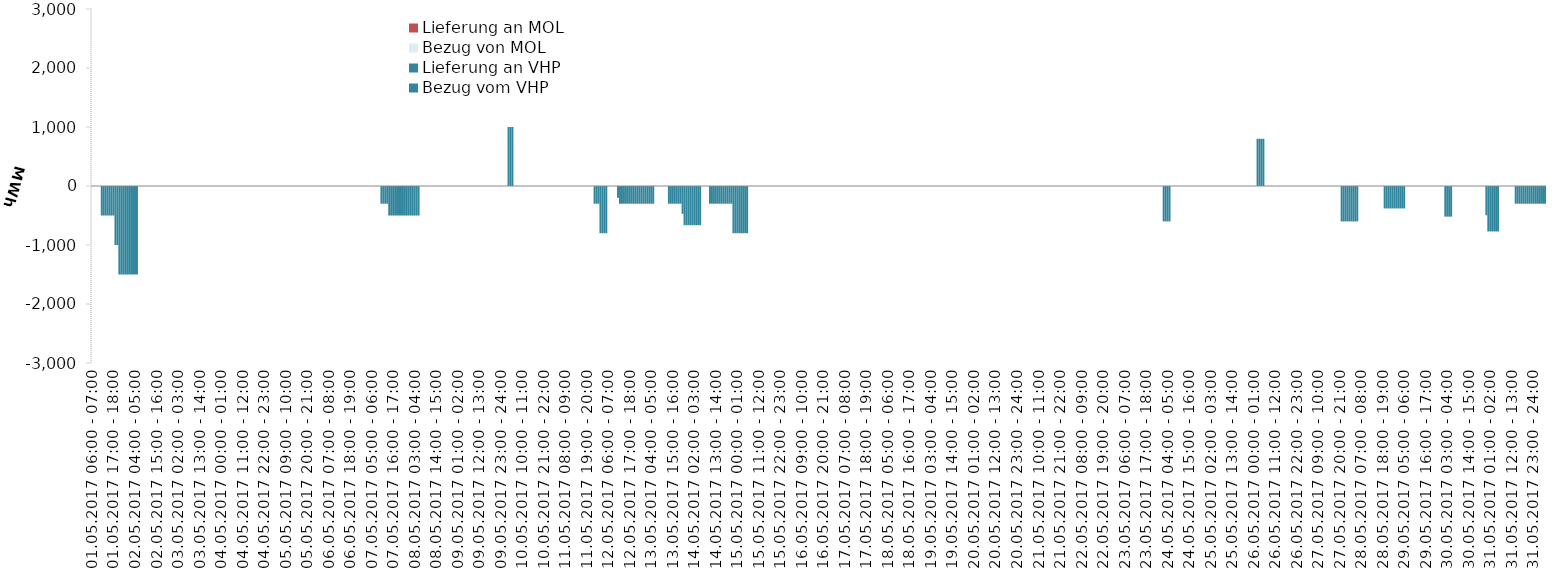
| Category | Bezug vom VHP | Lieferung an VHP | Bezug von MOL | Lieferung an MOL |
|---|---|---|---|---|
| 01.05.2017 06:00 - 07:00 | 0 | 0 | 0 | 0 |
| 01.05.2017 07:00 - 08:00 | 0 | 0 | 0 | 0 |
| 01.05.2017 08:00 - 09:00 | 0 | 0 | 0 | 0 |
| 01.05.2017 09:00 - 10:00 | 0 | 0 | 0 | 0 |
| 01.05.2017 10:00 - 11:00 | 0 | 0 | 0 | 0 |
| 01.05.2017 11:00 - 12:00 | 0 | -500 | 0 | 0 |
| 01.05.2017 12:00 - 13:00 | 0 | -500 | 0 | 0 |
| 01.05.2017 13:00 - 14:00 | 0 | -500 | 0 | 0 |
| 01.05.2017 14:00 - 15:00 | 0 | -500 | 0 | 0 |
| 01.05.2017 15:00 - 16:00 | 0 | -500 | 0 | 0 |
| 01.05.2017 16:00 - 17:00 | 0 | -500 | 0 | 0 |
| 01.05.2017 17:00 - 18:00 | 0 | -500 | 0 | 0 |
| 01.05.2017 18:00 - 19:00 | 0 | -1000 | 0 | 0 |
| 01.05.2017 19:00 - 20:00 | 0 | -1000 | 0 | 0 |
| 01.05.2017 20:00 - 21:00 | 0 | -1500 | 0 | 0 |
| 01.05.2017 21:00 - 22:00 | 0 | -1500 | 0 | 0 |
| 01.05.2017 22:00 - 23:00 | 0 | -1500 | 0 | 0 |
| 01.05.2017 23:00 - 24:00 | 0 | -1500 | 0 | 0 |
| 02.05.2017 00:00 - 01:00 | 0 | -1500 | 0 | 0 |
| 02.05.2017 01:00 - 02:00 | 0 | -1500 | 0 | 0 |
| 02.05.2017 02:00 - 03:00 | 0 | -1500 | 0 | 0 |
| 02.05.2017 03:00 - 04:00 | 0 | -1500 | 0 | 0 |
| 02.05.2017 04:00 - 05:00 | 0 | -1500 | 0 | 0 |
| 02.05.2017 05:00 - 06:00 | 0 | -1500 | 0 | 0 |
| 02.05.2017 06:00 - 07:00 | 0 | 0 | 0 | 0 |
| 02.05.2017 07:00 - 08:00 | 0 | 0 | 0 | 0 |
| 02.05.2017 08:00 - 09:00 | 0 | 0 | 0 | 0 |
| 02.05.2017 09:00 - 10:00 | 0 | 0 | 0 | 0 |
| 02.05.2017 10:00 - 11:00 | 0 | 0 | 0 | 0 |
| 02.05.2017 11:00 - 12:00 | 0 | 0 | 0 | 0 |
| 02.05.2017 12:00 - 13:00 | 0 | 0 | 0 | 0 |
| 02.05.2017 13:00 - 14:00 | 0 | 0 | 0 | 0 |
| 02.05.2017 14:00 - 15:00 | 0 | 0 | 0 | 0 |
| 02.05.2017 15:00 - 16:00 | 0 | 0 | 0 | 0 |
| 02.05.2017 16:00 - 17:00 | 0 | 0 | 0 | 0 |
| 02.05.2017 17:00 - 18:00 | 0 | 0 | 0 | 0 |
| 02.05.2017 18:00 - 19:00 | 0 | 0 | 0 | 0 |
| 02.05.2017 19:00 - 20:00 | 0 | 0 | 0 | 0 |
| 02.05.2017 20:00 - 21:00 | 0 | 0 | 0 | 0 |
| 02.05.2017 21:00 - 22:00 | 0 | 0 | 0 | 0 |
| 02.05.2017 22:00 - 23:00 | 0 | 0 | 0 | 0 |
| 02.05.2017 23:00 - 24:00 | 0 | 0 | 0 | 0 |
| 03.05.2017 00:00 - 01:00 | 0 | 0 | 0 | 0 |
| 03.05.2017 01:00 - 02:00 | 0 | 0 | 0 | 0 |
| 03.05.2017 02:00 - 03:00 | 0 | 0 | 0 | 0 |
| 03.05.2017 03:00 - 04:00 | 0 | 0 | 0 | 0 |
| 03.05.2017 04:00 - 05:00 | 0 | 0 | 0 | 0 |
| 03.05.2017 05:00 - 06:00 | 0 | 0 | 0 | 0 |
| 03.05.2017 06:00 - 07:00 | 0 | 0 | 0 | 0 |
| 03.05.2017 07:00 - 08:00 | 0 | 0 | 0 | 0 |
| 03.05.2017 08:00 - 09:00 | 0 | 0 | 0 | 0 |
| 03.05.2017 09:00 - 10:00 | 0 | 0 | 0 | 0 |
| 03.05.2017 10:00 - 11:00 | 0 | 0 | 0 | 0 |
| 03.05.2017 11:00 - 12:00 | 0 | 0 | 0 | 0 |
| 03.05.2017 12:00 - 13:00 | 0 | 0 | 0 | 0 |
| 03.05.2017 13:00 - 14:00 | 0 | 0 | 0 | 0 |
| 03.05.2017 14:00 - 15:00 | 0 | 0 | 0 | 0 |
| 03.05.2017 15:00 - 16:00 | 0 | 0 | 0 | 0 |
| 03.05.2017 16:00 - 17:00 | 0 | 0 | 0 | 0 |
| 03.05.2017 17:00 - 18:00 | 0 | 0 | 0 | 0 |
| 03.05.2017 18:00 - 19:00 | 0 | 0 | 0 | 0 |
| 03.05.2017 19:00 - 20:00 | 0 | 0 | 0 | 0 |
| 03.05.2017 20:00 - 21:00 | 0 | 0 | 0 | 0 |
| 03.05.2017 21:00 - 22:00 | 0 | 0 | 0 | 0 |
| 03.05.2017 22:00 - 23:00 | 0 | 0 | 0 | 0 |
| 03.05.2017 23:00 - 24:00 | 0 | 0 | 0 | 0 |
| 04.05.2017 00:00 - 01:00 | 0 | 0 | 0 | 0 |
| 04.05.2017 01:00 - 02:00 | 0 | 0 | 0 | 0 |
| 04.05.2017 02:00 - 03:00 | 0 | 0 | 0 | 0 |
| 04.05.2017 03:00 - 04:00 | 0 | 0 | 0 | 0 |
| 04.05.2017 04:00 - 05:00 | 0 | 0 | 0 | 0 |
| 04.05.2017 05:00 - 06:00 | 0 | 0 | 0 | 0 |
| 04.05.2017 06:00 - 07:00 | 0 | 0 | 0 | 0 |
| 04.05.2017 07:00 - 08:00 | 0 | 0 | 0 | 0 |
| 04.05.2017 08:00 - 09:00 | 0 | 0 | 0 | 0 |
| 04.05.2017 09:00 - 10:00 | 0 | 0 | 0 | 0 |
| 04.05.2017 10:00 - 11:00 | 0 | 0 | 0 | 0 |
| 04.05.2017 11:00 - 12:00 | 0 | 0 | 0 | 0 |
| 04.05.2017 12:00 - 13:00 | 0 | 0 | 0 | 0 |
| 04.05.2017 13:00 - 14:00 | 0 | 0 | 0 | 0 |
| 04.05.2017 14:00 - 15:00 | 0 | 0 | 0 | 0 |
| 04.05.2017 15:00 - 16:00 | 0 | 0 | 0 | 0 |
| 04.05.2017 16:00 - 17:00 | 0 | 0 | 0 | 0 |
| 04.05.2017 17:00 - 18:00 | 0 | 0 | 0 | 0 |
| 04.05.2017 18:00 - 19:00 | 0 | 0 | 0 | 0 |
| 04.05.2017 19:00 - 20:00 | 0 | 0 | 0 | 0 |
| 04.05.2017 20:00 - 21:00 | 0 | 0 | 0 | 0 |
| 04.05.2017 21:00 - 22:00 | 0 | 0 | 0 | 0 |
| 04.05.2017 22:00 - 23:00 | 0 | 0 | 0 | 0 |
| 04.05.2017 23:00 - 24:00 | 0 | 0 | 0 | 0 |
| 05.05.2017 00:00 - 01:00 | 0 | 0 | 0 | 0 |
| 05.05.2017 01:00 - 02:00 | 0 | 0 | 0 | 0 |
| 05.05.2017 02:00 - 03:00 | 0 | 0 | 0 | 0 |
| 05.05.2017 03:00 - 04:00 | 0 | 0 | 0 | 0 |
| 05.05.2017 04:00 - 05:00 | 0 | 0 | 0 | 0 |
| 05.05.2017 05:00 - 06:00 | 0 | 0 | 0 | 0 |
| 05.05.2017 06:00 - 07:00 | 0 | 0 | 0 | 0 |
| 05.05.2017 07:00 - 08:00 | 0 | 0 | 0 | 0 |
| 05.05.2017 08:00 - 09:00 | 0 | 0 | 0 | 0 |
| 05.05.2017 09:00 - 10:00 | 0 | 0 | 0 | 0 |
| 05.05.2017 10:00 - 11:00 | 0 | 0 | 0 | 0 |
| 05.05.2017 11:00 - 12:00 | 0 | 0 | 0 | 0 |
| 05.05.2017 12:00 - 13:00 | 0 | 0 | 0 | 0 |
| 05.05.2017 13:00 - 14:00 | 0 | 0 | 0 | 0 |
| 05.05.2017 14:00 - 15:00 | 0 | 0 | 0 | 0 |
| 05.05.2017 15:00 - 16:00 | 0 | 0 | 0 | 0 |
| 05.05.2017 16:00 - 17:00 | 0 | 0 | 0 | 0 |
| 05.05.2017 17:00 - 18:00 | 0 | 0 | 0 | 0 |
| 05.05.2017 18:00 - 19:00 | 0 | 0 | 0 | 0 |
| 05.05.2017 19:00 - 20:00 | 0 | 0 | 0 | 0 |
| 05.05.2017 20:00 - 21:00 | 0 | 0 | 0 | 0 |
| 05.05.2017 21:00 - 22:00 | 0 | 0 | 0 | 0 |
| 05.05.2017 22:00 - 23:00 | 0 | 0 | 0 | 0 |
| 05.05.2017 23:00 - 24:00 | 0 | 0 | 0 | 0 |
| 06.05.2017 00:00 - 01:00 | 0 | 0 | 0 | 0 |
| 06.05.2017 01:00 - 02:00 | 0 | 0 | 0 | 0 |
| 06.05.2017 02:00 - 03:00 | 0 | 0 | 0 | 0 |
| 06.05.2017 03:00 - 04:00 | 0 | 0 | 0 | 0 |
| 06.05.2017 04:00 - 05:00 | 0 | 0 | 0 | 0 |
| 06.05.2017 05:00 - 06:00 | 0 | 0 | 0 | 0 |
| 06.05.2017 06:00 - 07:00 | 0 | 0 | 0 | 0 |
| 06.05.2017 07:00 - 08:00 | 0 | 0 | 0 | 0 |
| 06.05.2017 08:00 - 09:00 | 0 | 0 | 0 | 0 |
| 06.05.2017 09:00 - 10:00 | 0 | 0 | 0 | 0 |
| 06.05.2017 10:00 - 11:00 | 0 | 0 | 0 | 0 |
| 06.05.2017 11:00 - 12:00 | 0 | 0 | 0 | 0 |
| 06.05.2017 12:00 - 13:00 | 0 | 0 | 0 | 0 |
| 06.05.2017 13:00 - 14:00 | 0 | 0 | 0 | 0 |
| 06.05.2017 14:00 - 15:00 | 0 | 0 | 0 | 0 |
| 06.05.2017 15:00 - 16:00 | 0 | 0 | 0 | 0 |
| 06.05.2017 16:00 - 17:00 | 0 | 0 | 0 | 0 |
| 06.05.2017 17:00 - 18:00 | 0 | 0 | 0 | 0 |
| 06.05.2017 18:00 - 19:00 | 0 | 0 | 0 | 0 |
| 06.05.2017 19:00 - 20:00 | 0 | 0 | 0 | 0 |
| 06.05.2017 20:00 - 21:00 | 0 | 0 | 0 | 0 |
| 06.05.2017 21:00 - 22:00 | 0 | 0 | 0 | 0 |
| 06.05.2017 22:00 - 23:00 | 0 | 0 | 0 | 0 |
| 06.05.2017 23:00 - 24:00 | 0 | 0 | 0 | 0 |
| 07.05.2017 00:00 - 01:00 | 0 | 0 | 0 | 0 |
| 07.05.2017 01:00 - 02:00 | 0 | 0 | 0 | 0 |
| 07.05.2017 02:00 - 03:00 | 0 | 0 | 0 | 0 |
| 07.05.2017 03:00 - 04:00 | 0 | 0 | 0 | 0 |
| 07.05.2017 04:00 - 05:00 | 0 | 0 | 0 | 0 |
| 07.05.2017 05:00 - 06:00 | 0 | 0 | 0 | 0 |
| 07.05.2017 06:00 - 07:00 | 0 | 0 | 0 | 0 |
| 07.05.2017 07:00 - 08:00 | 0 | 0 | 0 | 0 |
| 07.05.2017 08:00 - 09:00 | 0 | 0 | 0 | 0 |
| 07.05.2017 09:00 - 10:00 | 0 | 0 | 0 | 0 |
| 07.05.2017 10:00 - 11:00 | 0 | -300 | 0 | 0 |
| 07.05.2017 11:00 - 12:00 | 0 | -300 | 0 | 0 |
| 07.05.2017 12:00 - 13:00 | 0 | -300 | 0 | 0 |
| 07.05.2017 13:00 - 14:00 | 0 | -300 | 0 | 0 |
| 07.05.2017 14:00 - 15:00 | 0 | -500 | 0 | 0 |
| 07.05.2017 15:00 - 16:00 | 0 | -500 | 0 | 0 |
| 07.05.2017 16:00 - 17:00 | 0 | -500 | 0 | 0 |
| 07.05.2017 17:00 - 18:00 | 0 | -500 | 0 | 0 |
| 07.05.2017 18:00 - 19:00 | 0 | -500 | 0 | 0 |
| 07.05.2017 19:00 - 20:00 | 0 | -500 | 0 | 0 |
| 07.05.2017 20:00 - 21:00 | 0 | -500 | 0 | 0 |
| 07.05.2017 21:00 - 22:00 | 0 | -500 | 0 | 0 |
| 07.05.2017 22:00 - 23:00 | 0 | -500 | 0 | 0 |
| 07.05.2017 23:00 - 24:00 | 0 | -500 | 0 | 0 |
| 08.05.2017 00:00 - 01:00 | 0 | -500 | 0 | 0 |
| 08.05.2017 01:00 - 02:00 | 0 | -500 | 0 | 0 |
| 08.05.2017 02:00 - 03:00 | 0 | -500 | 0 | 0 |
| 08.05.2017 03:00 - 04:00 | 0 | -500 | 0 | 0 |
| 08.05.2017 04:00 - 05:00 | 0 | -500 | 0 | 0 |
| 08.05.2017 05:00 - 06:00 | 0 | -500 | 0 | 0 |
| 08.05.2017 06:00 - 07:00 | 0 | 0 | 0 | 0 |
| 08.05.2017 07:00 - 08:00 | 0 | 0 | 0 | 0 |
| 08.05.2017 08:00 - 09:00 | 0 | 0 | 0 | 0 |
| 08.05.2017 09:00 - 10:00 | 0 | 0 | 0 | 0 |
| 08.05.2017 10:00 - 11:00 | 0 | 0 | 0 | 0 |
| 08.05.2017 11:00 - 12:00 | 0 | 0 | 0 | 0 |
| 08.05.2017 12:00 - 13:00 | 0 | 0 | 0 | 0 |
| 08.05.2017 13:00 - 14:00 | 0 | 0 | 0 | 0 |
| 08.05.2017 14:00 - 15:00 | 0 | 0 | 0 | 0 |
| 08.05.2017 15:00 - 16:00 | 0 | 0 | 0 | 0 |
| 08.05.2017 16:00 - 17:00 | 0 | 0 | 0 | 0 |
| 08.05.2017 17:00 - 18:00 | 0 | 0 | 0 | 0 |
| 08.05.2017 18:00 - 19:00 | 0 | 0 | 0 | 0 |
| 08.05.2017 19:00 - 20:00 | 0 | 0 | 0 | 0 |
| 08.05.2017 20:00 - 21:00 | 0 | 0 | 0 | 0 |
| 08.05.2017 21:00 - 22:00 | 0 | 0 | 0 | 0 |
| 08.05.2017 22:00 - 23:00 | 0 | 0 | 0 | 0 |
| 08.05.2017 23:00 - 24:00 | 0 | 0 | 0 | 0 |
| 09.05.2017 00:00 - 01:00 | 0 | 0 | 0 | 0 |
| 09.05.2017 01:00 - 02:00 | 0 | 0 | 0 | 0 |
| 09.05.2017 02:00 - 03:00 | 0 | 0 | 0 | 0 |
| 09.05.2017 03:00 - 04:00 | 0 | 0 | 0 | 0 |
| 09.05.2017 04:00 - 05:00 | 0 | 0 | 0 | 0 |
| 09.05.2017 05:00 - 06:00 | 0 | 0 | 0 | 0 |
| 09.05.2017 06:00 - 07:00 | 0 | 0 | 0 | 0 |
| 09.05.2017 07:00 - 08:00 | 0 | 0 | 0 | 0 |
| 09.05.2017 08:00 - 09:00 | 0 | 0 | 0 | 0 |
| 09.05.2017 09:00 - 10:00 | 0 | 0 | 0 | 0 |
| 09.05.2017 10:00 - 11:00 | 0 | 0 | 0 | 0 |
| 09.05.2017 11:00 - 12:00 | 0 | 0 | 0 | 0 |
| 09.05.2017 12:00 - 13:00 | 0 | 0 | 0 | 0 |
| 09.05.2017 13:00 - 14:00 | 0 | 0 | 0 | 0 |
| 09.05.2017 14:00 - 15:00 | 0 | 0 | 0 | 0 |
| 09.05.2017 15:00 - 16:00 | 0 | 0 | 0 | 0 |
| 09.05.2017 16:00 - 17:00 | 0 | 0 | 0 | 0 |
| 09.05.2017 17:00 - 18:00 | 0 | 0 | 0 | 0 |
| 09.05.2017 18:00 - 19:00 | 0 | 0 | 0 | 0 |
| 09.05.2017 19:00 - 20:00 | 0 | 0 | 0 | 0 |
| 09.05.2017 20:00 - 21:00 | 0 | 0 | 0 | 0 |
| 09.05.2017 21:00 - 22:00 | 0 | 0 | 0 | 0 |
| 09.05.2017 22:00 - 23:00 | 0 | 0 | 0 | 0 |
| 09.05.2017 23:00 - 24:00 | 0 | 0 | 0 | 0 |
| 10.05.2017 00:00 - 01:00 | 0 | 0 | 0 | 0 |
| 10.05.2017 01:00 - 02:00 | 0 | 0 | 0 | 0 |
| 10.05.2017 02:00 - 03:00 | 0 | 0 | 0 | 0 |
| 10.05.2017 03:00 - 04:00 | 1000 | 0 | 0 | 0 |
| 10.05.2017 04:00 - 05:00 | 1000 | 0 | 0 | 0 |
| 10.05.2017 05:00 - 06:00 | 1000 | 0 | 0 | 0 |
| 10.05.2017 06:00 - 07:00 | 0 | 0 | 0 | 0 |
| 10.05.2017 07:00 - 08:00 | 0 | 0 | 0 | 0 |
| 10.05.2017 08:00 - 09:00 | 0 | 0 | 0 | 0 |
| 10.05.2017 09:00 - 10:00 | 0 | 0 | 0 | 0 |
| 10.05.2017 10:00 - 11:00 | 0 | 0 | 0 | 0 |
| 10.05.2017 11:00 - 12:00 | 0 | 0 | 0 | 0 |
| 10.05.2017 12:00 - 13:00 | 0 | 0 | 0 | 0 |
| 10.05.2017 13:00 - 14:00 | 0 | 0 | 0 | 0 |
| 10.05.2017 14:00 - 15:00 | 0 | 0 | 0 | 0 |
| 10.05.2017 15:00 - 16:00 | 0 | 0 | 0 | 0 |
| 10.05.2017 16:00 - 17:00 | 0 | 0 | 0 | 0 |
| 10.05.2017 17:00 - 18:00 | 0 | 0 | 0 | 0 |
| 10.05.2017 18:00 - 19:00 | 0 | 0 | 0 | 0 |
| 10.05.2017 19:00 - 20:00 | 0 | 0 | 0 | 0 |
| 10.05.2017 20:00 - 21:00 | 0 | 0 | 0 | 0 |
| 10.05.2017 21:00 - 22:00 | 0 | 0 | 0 | 0 |
| 10.05.2017 22:00 - 23:00 | 0 | 0 | 0 | 0 |
| 10.05.2017 23:00 - 24:00 | 0 | 0 | 0 | 0 |
| 11.05.2017 00:00 - 01:00 | 0 | 0 | 0 | 0 |
| 11.05.2017 01:00 - 02:00 | 0 | 0 | 0 | 0 |
| 11.05.2017 02:00 - 03:00 | 0 | 0 | 0 | 0 |
| 11.05.2017 03:00 - 04:00 | 0 | 0 | 0 | 0 |
| 11.05.2017 04:00 - 05:00 | 0 | 0 | 0 | 0 |
| 11.05.2017 05:00 - 06:00 | 0 | 0 | 0 | 0 |
| 11.05.2017 06:00 - 07:00 | 0 | 0 | 0 | 0 |
| 11.05.2017 07:00 - 08:00 | 0 | 0 | 0 | 0 |
| 11.05.2017 08:00 - 09:00 | 0 | 0 | 0 | 0 |
| 11.05.2017 09:00 - 10:00 | 0 | 0 | 0 | 0 |
| 11.05.2017 10:00 - 11:00 | 0 | 0 | 0 | 0 |
| 11.05.2017 11:00 - 12:00 | 0 | 0 | 0 | 0 |
| 11.05.2017 12:00 - 13:00 | 0 | 0 | 0 | 0 |
| 11.05.2017 13:00 - 14:00 | 0 | 0 | 0 | 0 |
| 11.05.2017 14:00 - 15:00 | 0 | 0 | 0 | 0 |
| 11.05.2017 15:00 - 16:00 | 0 | 0 | 0 | 0 |
| 11.05.2017 16:00 - 17:00 | 0 | 0 | 0 | 0 |
| 11.05.2017 17:00 - 18:00 | 0 | 0 | 0 | 0 |
| 11.05.2017 18:00 - 19:00 | 0 | 0 | 0 | 0 |
| 11.05.2017 19:00 - 20:00 | 0 | 0 | 0 | 0 |
| 11.05.2017 20:00 - 21:00 | 0 | 0 | 0 | 0 |
| 11.05.2017 21:00 - 22:00 | 0 | 0 | 0 | 0 |
| 11.05.2017 22:00 - 23:00 | 0 | 0 | 0 | 0 |
| 11.05.2017 23:00 - 24:00 | 0 | -300 | 0 | 0 |
| 12.05.2017 00:00 - 01:00 | 0 | -300 | 0 | 0 |
| 12.05.2017 01:00 - 02:00 | 0 | -300 | 0 | 0 |
| 12.05.2017 02:00 - 03:00 | 0 | -800 | 0 | 0 |
| 12.05.2017 03:00 - 04:00 | 0 | -800 | 0 | 0 |
| 12.05.2017 04:00 - 05:00 | 0 | -800 | 0 | 0 |
| 12.05.2017 05:00 - 06:00 | 0 | -800 | 0 | 0 |
| 12.05.2017 06:00 - 07:00 | 0 | 0 | 0 | 0 |
| 12.05.2017 07:00 - 08:00 | 0 | 0 | 0 | 0 |
| 12.05.2017 08:00 - 09:00 | 0 | 0 | 0 | 0 |
| 12.05.2017 09:00 - 10:00 | 0 | 0 | 0 | 0 |
| 12.05.2017 10:00 - 11:00 | 0 | 0 | 0 | 0 |
| 12.05.2017 11:00 - 12:00 | 0 | -200 | 0 | 0 |
| 12.05.2017 12:00 - 13:00 | 0 | -300 | 0 | 0 |
| 12.05.2017 13:00 - 14:00 | 0 | -300 | 0 | 0 |
| 12.05.2017 14:00 - 15:00 | 0 | -300 | 0 | 0 |
| 12.05.2017 15:00 - 16:00 | 0 | -300 | 0 | 0 |
| 12.05.2017 16:00 - 17:00 | 0 | -300 | 0 | 0 |
| 12.05.2017 17:00 - 18:00 | 0 | -300 | 0 | 0 |
| 12.05.2017 18:00 - 19:00 | 0 | -300 | 0 | 0 |
| 12.05.2017 19:00 - 20:00 | 0 | -300 | 0 | 0 |
| 12.05.2017 20:00 - 21:00 | 0 | -300 | 0 | 0 |
| 12.05.2017 21:00 - 22:00 | 0 | -300 | 0 | 0 |
| 12.05.2017 22:00 - 23:00 | 0 | -300 | 0 | 0 |
| 12.05.2017 23:00 - 24:00 | 0 | -300 | 0 | 0 |
| 13.05.2017 00:00 - 01:00 | 0 | -300 | 0 | 0 |
| 13.05.2017 01:00 - 02:00 | 0 | -300 | 0 | 0 |
| 13.05.2017 02:00 - 03:00 | 0 | -300 | 0 | 0 |
| 13.05.2017 03:00 - 04:00 | 0 | -300 | 0 | 0 |
| 13.05.2017 04:00 - 05:00 | 0 | -300 | 0 | 0 |
| 13.05.2017 05:00 - 06:00 | 0 | -300 | 0 | 0 |
| 13.05.2017 06:00 - 07:00 | 0 | 0 | 0 | 0 |
| 13.05.2017 07:00 - 08:00 | 0 | 0 | 0 | 0 |
| 13.05.2017 08:00 - 09:00 | 0 | 0 | 0 | 0 |
| 13.05.2017 09:00 - 10:00 | 0 | 0 | 0 | 0 |
| 13.05.2017 10:00 - 11:00 | 0 | 0 | 0 | 0 |
| 13.05.2017 11:00 - 12:00 | 0 | 0 | 0 | 0 |
| 13.05.2017 12:00 - 13:00 | 0 | 0 | 0 | 0 |
| 13.05.2017 13:00 - 14:00 | 0 | -300 | 0 | 0 |
| 13.05.2017 14:00 - 15:00 | 0 | -300 | 0 | 0 |
| 13.05.2017 15:00 - 16:00 | 0 | -300 | 0 | 0 |
| 13.05.2017 16:00 - 17:00 | 0 | -300 | 0 | 0 |
| 13.05.2017 17:00 - 18:00 | 0 | -300 | 0 | 0 |
| 13.05.2017 18:00 - 19:00 | 0 | -300 | 0 | 0 |
| 13.05.2017 19:00 - 20:00 | 0 | -300 | 0 | 0 |
| 13.05.2017 20:00 - 21:00 | 0 | -472 | 0 | 0 |
| 13.05.2017 21:00 - 22:00 | 0 | -664 | 0 | 0 |
| 13.05.2017 22:00 - 23:00 | 0 | -664 | 0 | 0 |
| 13.05.2017 23:00 - 24:00 | 0 | -664 | 0 | 0 |
| 14.05.2017 00:00 - 01:00 | 0 | -664 | 0 | 0 |
| 14.05.2017 01:00 - 02:00 | 0 | -664 | 0 | 0 |
| 14.05.2017 02:00 - 03:00 | 0 | -664 | 0 | 0 |
| 14.05.2017 03:00 - 04:00 | 0 | -664 | 0 | 0 |
| 14.05.2017 04:00 - 05:00 | 0 | -664 | 0 | 0 |
| 14.05.2017 05:00 - 06:00 | 0 | -664 | 0 | 0 |
| 14.05.2017 06:00 - 07:00 | 0 | 0 | 0 | 0 |
| 14.05.2017 07:00 - 08:00 | 0 | 0 | 0 | 0 |
| 14.05.2017 08:00 - 09:00 | 0 | 0 | 0 | 0 |
| 14.05.2017 09:00 - 10:00 | 0 | 0 | 0 | 0 |
| 14.05.2017 10:00 - 11:00 | 0 | -300 | 0 | 0 |
| 14.05.2017 11:00 - 12:00 | 0 | -300 | 0 | 0 |
| 14.05.2017 12:00 - 13:00 | 0 | -300 | 0 | 0 |
| 14.05.2017 13:00 - 14:00 | 0 | -300 | 0 | 0 |
| 14.05.2017 14:00 - 15:00 | 0 | -300 | 0 | 0 |
| 14.05.2017 15:00 - 16:00 | 0 | -300 | 0 | 0 |
| 14.05.2017 16:00 - 17:00 | 0 | -300 | 0 | 0 |
| 14.05.2017 17:00 - 18:00 | 0 | -300 | 0 | 0 |
| 14.05.2017 18:00 - 19:00 | 0 | -300 | 0 | 0 |
| 14.05.2017 19:00 - 20:00 | 0 | -300 | 0 | 0 |
| 14.05.2017 20:00 - 21:00 | 0 | -300 | 0 | 0 |
| 14.05.2017 21:00 - 22:00 | 0 | -300 | 0 | 0 |
| 14.05.2017 22:00 - 23:00 | 0 | -800 | 0 | 0 |
| 14.05.2017 23:00 - 24:00 | 0 | -800 | 0 | 0 |
| 15.05.2017 00:00 - 01:00 | 0 | -800 | 0 | 0 |
| 15.05.2017 01:00 - 02:00 | 0 | -800 | 0 | 0 |
| 15.05.2017 02:00 - 03:00 | 0 | -800 | 0 | 0 |
| 15.05.2017 03:00 - 04:00 | 0 | -800 | 0 | 0 |
| 15.05.2017 04:00 - 05:00 | 0 | -800 | 0 | 0 |
| 15.05.2017 05:00 - 06:00 | 0 | -800 | 0 | 0 |
| 15.05.2017 06:00 - 07:00 | 0 | 0 | 0 | 0 |
| 15.05.2017 07:00 - 08:00 | 0 | 0 | 0 | 0 |
| 15.05.2017 08:00 - 09:00 | 0 | 0 | 0 | 0 |
| 15.05.2017 09:00 - 10:00 | 0 | 0 | 0 | 0 |
| 15.05.2017 10:00 - 11:00 | 0 | 0 | 0 | 0 |
| 15.05.2017 11:00 - 12:00 | 0 | 0 | 0 | 0 |
| 15.05.2017 12:00 - 13:00 | 0 | 0 | 0 | 0 |
| 15.05.2017 13:00 - 14:00 | 0 | 0 | 0 | 0 |
| 15.05.2017 14:00 - 15:00 | 0 | 0 | 0 | 0 |
| 15.05.2017 15:00 - 16:00 | 0 | 0 | 0 | 0 |
| 15.05.2017 16:00 - 17:00 | 0 | 0 | 0 | 0 |
| 15.05.2017 17:00 - 18:00 | 0 | 0 | 0 | 0 |
| 15.05.2017 18:00 - 19:00 | 0 | 0 | 0 | 0 |
| 15.05.2017 19:00 - 20:00 | 0 | 0 | 0 | 0 |
| 15.05.2017 20:00 - 21:00 | 0 | 0 | 0 | 0 |
| 15.05.2017 21:00 - 22:00 | 0 | 0 | 0 | 0 |
| 15.05.2017 22:00 - 23:00 | 0 | 0 | 0 | 0 |
| 15.05.2017 23:00 - 24:00 | 0 | 0 | 0 | 0 |
| 16.05.2017 00:00 - 01:00 | 0 | 0 | 0 | 0 |
| 16.05.2017 01:00 - 02:00 | 0 | 0 | 0 | 0 |
| 16.05.2017 02:00 - 03:00 | 0 | 0 | 0 | 0 |
| 16.05.2017 03:00 - 04:00 | 0 | 0 | 0 | 0 |
| 16.05.2017 04:00 - 05:00 | 0 | 0 | 0 | 0 |
| 16.05.2017 05:00 - 06:00 | 0 | 0 | 0 | 0 |
| 16.05.2017 06:00 - 07:00 | 0 | 0 | 0 | 0 |
| 16.05.2017 07:00 - 08:00 | 0 | 0 | 0 | 0 |
| 16.05.2017 08:00 - 09:00 | 0 | 0 | 0 | 0 |
| 16.05.2017 09:00 - 10:00 | 0 | 0 | 0 | 0 |
| 16.05.2017 10:00 - 11:00 | 0 | 0 | 0 | 0 |
| 16.05.2017 11:00 - 12:00 | 0 | 0 | 0 | 0 |
| 16.05.2017 12:00 - 13:00 | 0 | 0 | 0 | 0 |
| 16.05.2017 13:00 - 14:00 | 0 | 0 | 0 | 0 |
| 16.05.2017 14:00 - 15:00 | 0 | 0 | 0 | 0 |
| 16.05.2017 15:00 - 16:00 | 0 | 0 | 0 | 0 |
| 16.05.2017 16:00 - 17:00 | 0 | 0 | 0 | 0 |
| 16.05.2017 17:00 - 18:00 | 0 | 0 | 0 | 0 |
| 16.05.2017 18:00 - 19:00 | 0 | 0 | 0 | 0 |
| 16.05.2017 19:00 - 20:00 | 0 | 0 | 0 | 0 |
| 16.05.2017 20:00 - 21:00 | 0 | 0 | 0 | 0 |
| 16.05.2017 21:00 - 22:00 | 0 | 0 | 0 | 0 |
| 16.05.2017 22:00 - 23:00 | 0 | 0 | 0 | 0 |
| 16.05.2017 23:00 - 24:00 | 0 | 0 | 0 | 0 |
| 17.05.2017 00:00 - 01:00 | 0 | 0 | 0 | 0 |
| 17.05.2017 01:00 - 02:00 | 0 | 0 | 0 | 0 |
| 17.05.2017 02:00 - 03:00 | 0 | 0 | 0 | 0 |
| 17.05.2017 03:00 - 04:00 | 0 | 0 | 0 | 0 |
| 17.05.2017 04:00 - 05:00 | 0 | 0 | 0 | 0 |
| 17.05.2017 05:00 - 06:00 | 0 | 0 | 0 | 0 |
| 17.05.2017 06:00 - 07:00 | 0 | 0 | 0 | 0 |
| 17.05.2017 07:00 - 08:00 | 0 | 0 | 0 | 0 |
| 17.05.2017 08:00 - 09:00 | 0 | 0 | 0 | 0 |
| 17.05.2017 09:00 - 10:00 | 0 | 0 | 0 | 0 |
| 17.05.2017 10:00 - 11:00 | 0 | 0 | 0 | 0 |
| 17.05.2017 11:00 - 12:00 | 0 | 0 | 0 | 0 |
| 17.05.2017 12:00 - 13:00 | 0 | 0 | 0 | 0 |
| 17.05.2017 13:00 - 14:00 | 0 | 0 | 0 | 0 |
| 17.05.2017 14:00 - 15:00 | 0 | 0 | 0 | 0 |
| 17.05.2017 15:00 - 16:00 | 0 | 0 | 0 | 0 |
| 17.05.2017 16:00 - 17:00 | 0 | 0 | 0 | 0 |
| 17.05.2017 17:00 - 18:00 | 0 | 0 | 0 | 0 |
| 17.05.2017 18:00 - 19:00 | 0 | 0 | 0 | 0 |
| 17.05.2017 19:00 - 20:00 | 0 | 0 | 0 | 0 |
| 17.05.2017 20:00 - 21:00 | 0 | 0 | 0 | 0 |
| 17.05.2017 21:00 - 22:00 | 0 | 0 | 0 | 0 |
| 17.05.2017 22:00 - 23:00 | 0 | 0 | 0 | 0 |
| 17.05.2017 23:00 - 24:00 | 0 | 0 | 0 | 0 |
| 18.05.2017 00:00 - 01:00 | 0 | 0 | 0 | 0 |
| 18.05.2017 01:00 - 02:00 | 0 | 0 | 0 | 0 |
| 18.05.2017 02:00 - 03:00 | 0 | 0 | 0 | 0 |
| 18.05.2017 03:00 - 04:00 | 0 | 0 | 0 | 0 |
| 18.05.2017 04:00 - 05:00 | 0 | 0 | 0 | 0 |
| 18.05.2017 05:00 - 06:00 | 0 | 0 | 0 | 0 |
| 18.05.2017 06:00 - 07:00 | 0 | 0 | 0 | 0 |
| 18.05.2017 07:00 - 08:00 | 0 | 0 | 0 | 0 |
| 18.05.2017 08:00 - 09:00 | 0 | 0 | 0 | 0 |
| 18.05.2017 09:00 - 10:00 | 0 | 0 | 0 | 0 |
| 18.05.2017 10:00 - 11:00 | 0 | 0 | 0 | 0 |
| 18.05.2017 11:00 - 12:00 | 0 | 0 | 0 | 0 |
| 18.05.2017 12:00 - 13:00 | 0 | 0 | 0 | 0 |
| 18.05.2017 13:00 - 14:00 | 0 | 0 | 0 | 0 |
| 18.05.2017 14:00 - 15:00 | 0 | 0 | 0 | 0 |
| 18.05.2017 15:00 - 16:00 | 0 | 0 | 0 | 0 |
| 18.05.2017 16:00 - 17:00 | 0 | 0 | 0 | 0 |
| 18.05.2017 17:00 - 18:00 | 0 | 0 | 0 | 0 |
| 18.05.2017 18:00 - 19:00 | 0 | 0 | 0 | 0 |
| 18.05.2017 19:00 - 20:00 | 0 | 0 | 0 | 0 |
| 18.05.2017 20:00 - 21:00 | 0 | 0 | 0 | 0 |
| 18.05.2017 21:00 - 22:00 | 0 | 0 | 0 | 0 |
| 18.05.2017 22:00 - 23:00 | 0 | 0 | 0 | 0 |
| 18.05.2017 23:00 - 24:00 | 0 | 0 | 0 | 0 |
| 19.05.2017 00:00 - 01:00 | 0 | 0 | 0 | 0 |
| 19.05.2017 01:00 - 02:00 | 0 | 0 | 0 | 0 |
| 19.05.2017 02:00 - 03:00 | 0 | 0 | 0 | 0 |
| 19.05.2017 03:00 - 04:00 | 0 | 0 | 0 | 0 |
| 19.05.2017 04:00 - 05:00 | 0 | 0 | 0 | 0 |
| 19.05.2017 05:00 - 06:00 | 0 | 0 | 0 | 0 |
| 19.05.2017 06:00 - 07:00 | 0 | 0 | 0 | 0 |
| 19.05.2017 07:00 - 08:00 | 0 | 0 | 0 | 0 |
| 19.05.2017 08:00 - 09:00 | 0 | 0 | 0 | 0 |
| 19.05.2017 09:00 - 10:00 | 0 | 0 | 0 | 0 |
| 19.05.2017 10:00 - 11:00 | 0 | 0 | 0 | 0 |
| 19.05.2017 11:00 - 12:00 | 0 | 0 | 0 | 0 |
| 19.05.2017 12:00 - 13:00 | 0 | 0 | 0 | 0 |
| 19.05.2017 13:00 - 14:00 | 0 | 0 | 0 | 0 |
| 19.05.2017 14:00 - 15:00 | 0 | 0 | 0 | 0 |
| 19.05.2017 15:00 - 16:00 | 0 | 0 | 0 | 0 |
| 19.05.2017 16:00 - 17:00 | 0 | 0 | 0 | 0 |
| 19.05.2017 17:00 - 18:00 | 0 | 0 | 0 | 0 |
| 19.05.2017 18:00 - 19:00 | 0 | 0 | 0 | 0 |
| 19.05.2017 19:00 - 20:00 | 0 | 0 | 0 | 0 |
| 19.05.2017 20:00 - 21:00 | 0 | 0 | 0 | 0 |
| 19.05.2017 21:00 - 22:00 | 0 | 0 | 0 | 0 |
| 19.05.2017 22:00 - 23:00 | 0 | 0 | 0 | 0 |
| 19.05.2017 23:00 - 24:00 | 0 | 0 | 0 | 0 |
| 20.05.2017 00:00 - 01:00 | 0 | 0 | 0 | 0 |
| 20.05.2017 01:00 - 02:00 | 0 | 0 | 0 | 0 |
| 20.05.2017 02:00 - 03:00 | 0 | 0 | 0 | 0 |
| 20.05.2017 03:00 - 04:00 | 0 | 0 | 0 | 0 |
| 20.05.2017 04:00 - 05:00 | 0 | 0 | 0 | 0 |
| 20.05.2017 05:00 - 06:00 | 0 | 0 | 0 | 0 |
| 20.05.2017 06:00 - 07:00 | 0 | 0 | 0 | 0 |
| 20.05.2017 07:00 - 08:00 | 0 | 0 | 0 | 0 |
| 20.05.2017 08:00 - 09:00 | 0 | 0 | 0 | 0 |
| 20.05.2017 09:00 - 10:00 | 0 | 0 | 0 | 0 |
| 20.05.2017 10:00 - 11:00 | 0 | 0 | 0 | 0 |
| 20.05.2017 11:00 - 12:00 | 0 | 0 | 0 | 0 |
| 20.05.2017 12:00 - 13:00 | 0 | 0 | 0 | 0 |
| 20.05.2017 13:00 - 14:00 | 0 | 0 | 0 | 0 |
| 20.05.2017 14:00 - 15:00 | 0 | 0 | 0 | 0 |
| 20.05.2017 15:00 - 16:00 | 0 | 0 | 0 | 0 |
| 20.05.2017 16:00 - 17:00 | 0 | 0 | 0 | 0 |
| 20.05.2017 17:00 - 18:00 | 0 | 0 | 0 | 0 |
| 20.05.2017 18:00 - 19:00 | 0 | 0 | 0 | 0 |
| 20.05.2017 19:00 - 20:00 | 0 | 0 | 0 | 0 |
| 20.05.2017 20:00 - 21:00 | 0 | 0 | 0 | 0 |
| 20.05.2017 21:00 - 22:00 | 0 | 0 | 0 | 0 |
| 20.05.2017 22:00 - 23:00 | 0 | 0 | 0 | 0 |
| 20.05.2017 23:00 - 24:00 | 0 | 0 | 0 | 0 |
| 21.05.2017 00:00 - 01:00 | 0 | 0 | 0 | 0 |
| 21.05.2017 01:00 - 02:00 | 0 | 0 | 0 | 0 |
| 21.05.2017 02:00 - 03:00 | 0 | 0 | 0 | 0 |
| 21.05.2017 03:00 - 04:00 | 0 | 0 | 0 | 0 |
| 21.05.2017 04:00 - 05:00 | 0 | 0 | 0 | 0 |
| 21.05.2017 05:00 - 06:00 | 0 | 0 | 0 | 0 |
| 21.05.2017 06:00 - 07:00 | 0 | 0 | 0 | 0 |
| 21.05.2017 07:00 - 08:00 | 0 | 0 | 0 | 0 |
| 21.05.2017 08:00 - 09:00 | 0 | 0 | 0 | 0 |
| 21.05.2017 09:00 - 10:00 | 0 | 0 | 0 | 0 |
| 21.05.2017 10:00 - 11:00 | 0 | 0 | 0 | 0 |
| 21.05.2017 11:00 - 12:00 | 0 | 0 | 0 | 0 |
| 21.05.2017 12:00 - 13:00 | 0 | 0 | 0 | 0 |
| 21.05.2017 13:00 - 14:00 | 0 | 0 | 0 | 0 |
| 21.05.2017 14:00 - 15:00 | 0 | 0 | 0 | 0 |
| 21.05.2017 15:00 - 16:00 | 0 | 0 | 0 | 0 |
| 21.05.2017 16:00 - 17:00 | 0 | 0 | 0 | 0 |
| 21.05.2017 17:00 - 18:00 | 0 | 0 | 0 | 0 |
| 21.05.2017 18:00 - 19:00 | 0 | 0 | 0 | 0 |
| 21.05.2017 19:00 - 20:00 | 0 | 0 | 0 | 0 |
| 21.05.2017 20:00 - 21:00 | 0 | 0 | 0 | 0 |
| 21.05.2017 21:00 - 22:00 | 0 | 0 | 0 | 0 |
| 21.05.2017 22:00 - 23:00 | 0 | 0 | 0 | 0 |
| 21.05.2017 23:00 - 24:00 | 0 | 0 | 0 | 0 |
| 22.05.2017 00:00 - 01:00 | 0 | 0 | 0 | 0 |
| 22.05.2017 01:00 - 02:00 | 0 | 0 | 0 | 0 |
| 22.05.2017 02:00 - 03:00 | 0 | 0 | 0 | 0 |
| 22.05.2017 03:00 - 04:00 | 0 | 0 | 0 | 0 |
| 22.05.2017 04:00 - 05:00 | 0 | 0 | 0 | 0 |
| 22.05.2017 05:00 - 06:00 | 0 | 0 | 0 | 0 |
| 22.05.2017 06:00 - 07:00 | 0 | 0 | 0 | 0 |
| 22.05.2017 07:00 - 08:00 | 0 | 0 | 0 | 0 |
| 22.05.2017 08:00 - 09:00 | 0 | 0 | 0 | 0 |
| 22.05.2017 09:00 - 10:00 | 0 | 0 | 0 | 0 |
| 22.05.2017 10:00 - 11:00 | 0 | 0 | 0 | 0 |
| 22.05.2017 11:00 - 12:00 | 0 | 0 | 0 | 0 |
| 22.05.2017 12:00 - 13:00 | 0 | 0 | 0 | 0 |
| 22.05.2017 13:00 - 14:00 | 0 | 0 | 0 | 0 |
| 22.05.2017 14:00 - 15:00 | 0 | 0 | 0 | 0 |
| 22.05.2017 15:00 - 16:00 | 0 | 0 | 0 | 0 |
| 22.05.2017 16:00 - 17:00 | 0 | 0 | 0 | 0 |
| 22.05.2017 17:00 - 18:00 | 0 | 0 | 0 | 0 |
| 22.05.2017 18:00 - 19:00 | 0 | 0 | 0 | 0 |
| 22.05.2017 19:00 - 20:00 | 0 | 0 | 0 | 0 |
| 22.05.2017 20:00 - 21:00 | 0 | 0 | 0 | 0 |
| 22.05.2017 21:00 - 22:00 | 0 | 0 | 0 | 0 |
| 22.05.2017 22:00 - 23:00 | 0 | 0 | 0 | 0 |
| 22.05.2017 23:00 - 24:00 | 0 | 0 | 0 | 0 |
| 23.05.2017 00:00 - 01:00 | 0 | 0 | 0 | 0 |
| 23.05.2017 01:00 - 02:00 | 0 | 0 | 0 | 0 |
| 23.05.2017 02:00 - 03:00 | 0 | 0 | 0 | 0 |
| 23.05.2017 03:00 - 04:00 | 0 | 0 | 0 | 0 |
| 23.05.2017 04:00 - 05:00 | 0 | 0 | 0 | 0 |
| 23.05.2017 05:00 - 06:00 | 0 | 0 | 0 | 0 |
| 23.05.2017 06:00 - 07:00 | 0 | 0 | 0 | 0 |
| 23.05.2017 07:00 - 08:00 | 0 | 0 | 0 | 0 |
| 23.05.2017 08:00 - 09:00 | 0 | 0 | 0 | 0 |
| 23.05.2017 09:00 - 10:00 | 0 | 0 | 0 | 0 |
| 23.05.2017 10:00 - 11:00 | 0 | 0 | 0 | 0 |
| 23.05.2017 11:00 - 12:00 | 0 | 0 | 0 | 0 |
| 23.05.2017 12:00 - 13:00 | 0 | 0 | 0 | 0 |
| 23.05.2017 13:00 - 14:00 | 0 | 0 | 0 | 0 |
| 23.05.2017 14:00 - 15:00 | 0 | 0 | 0 | 0 |
| 23.05.2017 15:00 - 16:00 | 0 | 0 | 0 | 0 |
| 23.05.2017 16:00 - 17:00 | 0 | 0 | 0 | 0 |
| 23.05.2017 17:00 - 18:00 | 0 | 0 | 0 | 0 |
| 23.05.2017 18:00 - 19:00 | 0 | 0 | 0 | 0 |
| 23.05.2017 19:00 - 20:00 | 0 | 0 | 0 | 0 |
| 23.05.2017 20:00 - 21:00 | 0 | 0 | 0 | 0 |
| 23.05.2017 21:00 - 22:00 | 0 | 0 | 0 | 0 |
| 23.05.2017 22:00 - 23:00 | 0 | 0 | 0 | 0 |
| 23.05.2017 23:00 - 24:00 | 0 | 0 | 0 | 0 |
| 24.05.2017 00:00 - 01:00 | 0 | 0 | 0 | 0 |
| 24.05.2017 01:00 - 02:00 | 0 | 0 | 0 | 0 |
| 24.05.2017 02:00 - 03:00 | 0 | -600 | 0 | 0 |
| 24.05.2017 03:00 - 04:00 | 0 | -600 | 0 | 0 |
| 24.05.2017 04:00 - 05:00 | 0 | -600 | 0 | 0 |
| 24.05.2017 05:00 - 06:00 | 0 | -600 | 0 | 0 |
| 24.05.2017 06:00 - 07:00 | 0 | 0 | 0 | 0 |
| 24.05.2017 07:00 - 08:00 | 0 | 0 | 0 | 0 |
| 24.05.2017 08:00 - 09:00 | 0 | 0 | 0 | 0 |
| 24.05.2017 09:00 - 10:00 | 0 | 0 | 0 | 0 |
| 24.05.2017 10:00 - 11:00 | 0 | 0 | 0 | 0 |
| 24.05.2017 11:00 - 12:00 | 0 | 0 | 0 | 0 |
| 24.05.2017 12:00 - 13:00 | 0 | 0 | 0 | 0 |
| 24.05.2017 13:00 - 14:00 | 0 | 0 | 0 | 0 |
| 24.05.2017 14:00 - 15:00 | 0 | 0 | 0 | 0 |
| 24.05.2017 15:00 - 16:00 | 0 | 0 | 0 | 0 |
| 24.05.2017 16:00 - 17:00 | 0 | 0 | 0 | 0 |
| 24.05.2017 17:00 - 18:00 | 0 | 0 | 0 | 0 |
| 24.05.2017 18:00 - 19:00 | 0 | 0 | 0 | 0 |
| 24.05.2017 19:00 - 20:00 | 0 | 0 | 0 | 0 |
| 24.05.2017 20:00 - 21:00 | 0 | 0 | 0 | 0 |
| 24.05.2017 21:00 - 22:00 | 0 | 0 | 0 | 0 |
| 24.05.2017 22:00 - 23:00 | 0 | 0 | 0 | 0 |
| 24.05.2017 23:00 - 24:00 | 0 | 0 | 0 | 0 |
| 25.05.2017 00:00 - 01:00 | 0 | 0 | 0 | 0 |
| 25.05.2017 01:00 - 02:00 | 0 | 0 | 0 | 0 |
| 25.05.2017 02:00 - 03:00 | 0 | 0 | 0 | 0 |
| 25.05.2017 03:00 - 04:00 | 0 | 0 | 0 | 0 |
| 25.05.2017 04:00 - 05:00 | 0 | 0 | 0 | 0 |
| 25.05.2017 05:00 - 06:00 | 0 | 0 | 0 | 0 |
| 25.05.2017 06:00 - 07:00 | 0 | 0 | 0 | 0 |
| 25.05.2017 07:00 - 08:00 | 0 | 0 | 0 | 0 |
| 25.05.2017 08:00 - 09:00 | 0 | 0 | 0 | 0 |
| 25.05.2017 09:00 - 10:00 | 0 | 0 | 0 | 0 |
| 25.05.2017 10:00 - 11:00 | 0 | 0 | 0 | 0 |
| 25.05.2017 11:00 - 12:00 | 0 | 0 | 0 | 0 |
| 25.05.2017 12:00 - 13:00 | 0 | 0 | 0 | 0 |
| 25.05.2017 13:00 - 14:00 | 0 | 0 | 0 | 0 |
| 25.05.2017 14:00 - 15:00 | 0 | 0 | 0 | 0 |
| 25.05.2017 15:00 - 16:00 | 0 | 0 | 0 | 0 |
| 25.05.2017 16:00 - 17:00 | 0 | 0 | 0 | 0 |
| 25.05.2017 17:00 - 18:00 | 0 | 0 | 0 | 0 |
| 25.05.2017 18:00 - 19:00 | 0 | 0 | 0 | 0 |
| 25.05.2017 19:00 - 20:00 | 0 | 0 | 0 | 0 |
| 25.05.2017 20:00 - 21:00 | 0 | 0 | 0 | 0 |
| 25.05.2017 21:00 - 22:00 | 0 | 0 | 0 | 0 |
| 25.05.2017 22:00 - 23:00 | 0 | 0 | 0 | 0 |
| 25.05.2017 23:00 - 24:00 | 0 | 0 | 0 | 0 |
| 26.05.2017 00:00 - 01:00 | 0 | 0 | 0 | 0 |
| 26.05.2017 01:00 - 02:00 | 0 | 0 | 0 | 0 |
| 26.05.2017 02:00 - 03:00 | 800 | 0 | 0 | 0 |
| 26.05.2017 03:00 - 04:00 | 800 | 0 | 0 | 0 |
| 26.05.2017 04:00 - 05:00 | 800 | 0 | 0 | 0 |
| 26.05.2017 05:00 - 06:00 | 800 | 0 | 0 | 0 |
| 26.05.2017 06:00 - 07:00 | 0 | 0 | 0 | 0 |
| 26.05.2017 07:00 - 08:00 | 0 | 0 | 0 | 0 |
| 26.05.2017 08:00 - 09:00 | 0 | 0 | 0 | 0 |
| 26.05.2017 09:00 - 10:00 | 0 | 0 | 0 | 0 |
| 26.05.2017 10:00 - 11:00 | 0 | 0 | 0 | 0 |
| 26.05.2017 11:00 - 12:00 | 0 | 0 | 0 | 0 |
| 26.05.2017 12:00 - 13:00 | 0 | 0 | 0 | 0 |
| 26.05.2017 13:00 - 14:00 | 0 | 0 | 0 | 0 |
| 26.05.2017 14:00 - 15:00 | 0 | 0 | 0 | 0 |
| 26.05.2017 15:00 - 16:00 | 0 | 0 | 0 | 0 |
| 26.05.2017 16:00 - 17:00 | 0 | 0 | 0 | 0 |
| 26.05.2017 17:00 - 18:00 | 0 | 0 | 0 | 0 |
| 26.05.2017 18:00 - 19:00 | 0 | 0 | 0 | 0 |
| 26.05.2017 19:00 - 20:00 | 0 | 0 | 0 | 0 |
| 26.05.2017 20:00 - 21:00 | 0 | 0 | 0 | 0 |
| 26.05.2017 21:00 - 22:00 | 0 | 0 | 0 | 0 |
| 26.05.2017 22:00 - 23:00 | 0 | 0 | 0 | 0 |
| 26.05.2017 23:00 - 24:00 | 0 | 0 | 0 | 0 |
| 27.05.2017 00:00 - 01:00 | 0 | 0 | 0 | 0 |
| 27.05.2017 01:00 - 02:00 | 0 | 0 | 0 | 0 |
| 27.05.2017 02:00 - 03:00 | 0 | 0 | 0 | 0 |
| 27.05.2017 03:00 - 04:00 | 0 | 0 | 0 | 0 |
| 27.05.2017 04:00 - 05:00 | 0 | 0 | 0 | 0 |
| 27.05.2017 05:00 - 06:00 | 0 | 0 | 0 | 0 |
| 27.05.2017 06:00 - 07:00 | 0 | 0 | 0 | 0 |
| 27.05.2017 07:00 - 08:00 | 0 | 0 | 0 | 0 |
| 27.05.2017 08:00 - 09:00 | 0 | 0 | 0 | 0 |
| 27.05.2017 09:00 - 10:00 | 0 | 0 | 0 | 0 |
| 27.05.2017 10:00 - 11:00 | 0 | 0 | 0 | 0 |
| 27.05.2017 11:00 - 12:00 | 0 | 0 | 0 | 0 |
| 27.05.2017 12:00 - 13:00 | 0 | 0 | 0 | 0 |
| 27.05.2017 13:00 - 14:00 | 0 | 0 | 0 | 0 |
| 27.05.2017 14:00 - 15:00 | 0 | 0 | 0 | 0 |
| 27.05.2017 15:00 - 16:00 | 0 | 0 | 0 | 0 |
| 27.05.2017 16:00 - 17:00 | 0 | 0 | 0 | 0 |
| 27.05.2017 17:00 - 18:00 | 0 | 0 | 0 | 0 |
| 27.05.2017 18:00 - 19:00 | 0 | 0 | 0 | 0 |
| 27.05.2017 19:00 - 20:00 | 0 | 0 | 0 | 0 |
| 27.05.2017 20:00 - 21:00 | 0 | 0 | 0 | 0 |
| 27.05.2017 21:00 - 22:00 | 0 | -600 | 0 | 0 |
| 27.05.2017 22:00 - 23:00 | 0 | -600 | 0 | 0 |
| 27.05.2017 23:00 - 24:00 | 0 | -600 | 0 | 0 |
| 28.05.2017 00:00 - 01:00 | 0 | -600 | 0 | 0 |
| 28.05.2017 01:00 - 02:00 | 0 | -600 | 0 | 0 |
| 28.05.2017 02:00 - 03:00 | 0 | -600 | 0 | 0 |
| 28.05.2017 03:00 - 04:00 | 0 | -600 | 0 | 0 |
| 28.05.2017 04:00 - 05:00 | 0 | -600 | 0 | 0 |
| 28.05.2017 05:00 - 06:00 | 0 | -600 | 0 | 0 |
| 28.05.2017 06:00 - 07:00 | 0 | 0 | 0 | 0 |
| 28.05.2017 07:00 - 08:00 | 0 | 0 | 0 | 0 |
| 28.05.2017 08:00 - 09:00 | 0 | 0 | 0 | 0 |
| 28.05.2017 09:00 - 10:00 | 0 | 0 | 0 | 0 |
| 28.05.2017 10:00 - 11:00 | 0 | 0 | 0 | 0 |
| 28.05.2017 11:00 - 12:00 | 0 | 0 | 0 | 0 |
| 28.05.2017 12:00 - 13:00 | 0 | 0 | 0 | 0 |
| 28.05.2017 13:00 - 14:00 | 0 | 0 | 0 | 0 |
| 28.05.2017 14:00 - 15:00 | 0 | 0 | 0 | 0 |
| 28.05.2017 15:00 - 16:00 | 0 | 0 | 0 | 0 |
| 28.05.2017 16:00 - 17:00 | 0 | 0 | 0 | 0 |
| 28.05.2017 17:00 - 18:00 | 0 | 0 | 0 | 0 |
| 28.05.2017 18:00 - 19:00 | 0 | 0 | 0 | 0 |
| 28.05.2017 19:00 - 20:00 | 0 | -380 | 0 | 0 |
| 28.05.2017 20:00 - 21:00 | 0 | -380 | 0 | 0 |
| 28.05.2017 21:00 - 22:00 | 0 | -380 | 0 | 0 |
| 28.05.2017 22:00 - 23:00 | 0 | -380 | 0 | 0 |
| 28.05.2017 23:00 - 24:00 | 0 | -380 | 0 | 0 |
| 29.05.2017 00:00 - 01:00 | 0 | -380 | 0 | 0 |
| 29.05.2017 01:00 - 02:00 | 0 | -380 | 0 | 0 |
| 29.05.2017 02:00 - 03:00 | 0 | -380 | 0 | 0 |
| 29.05.2017 03:00 - 04:00 | 0 | -380 | 0 | 0 |
| 29.05.2017 04:00 - 05:00 | 0 | -380 | 0 | 0 |
| 29.05.2017 05:00 - 06:00 | 0 | -380 | 0 | 0 |
| 29.05.2017 06:00 - 07:00 | 0 | 0 | 0 | 0 |
| 29.05.2017 07:00 - 08:00 | 0 | 0 | 0 | 0 |
| 29.05.2017 08:00 - 09:00 | 0 | 0 | 0 | 0 |
| 29.05.2017 09:00 - 10:00 | 0 | 0 | 0 | 0 |
| 29.05.2017 10:00 - 11:00 | 0 | 0 | 0 | 0 |
| 29.05.2017 11:00 - 12:00 | 0 | 0 | 0 | 0 |
| 29.05.2017 12:00 - 13:00 | 0 | 0 | 0 | 0 |
| 29.05.2017 13:00 - 14:00 | 0 | 0 | 0 | 0 |
| 29.05.2017 14:00 - 15:00 | 0 | 0 | 0 | 0 |
| 29.05.2017 15:00 - 16:00 | 0 | 0 | 0 | 0 |
| 29.05.2017 16:00 - 17:00 | 0 | 0 | 0 | 0 |
| 29.05.2017 17:00 - 18:00 | 0 | 0 | 0 | 0 |
| 29.05.2017 18:00 - 19:00 | 0 | 0 | 0 | 0 |
| 29.05.2017 19:00 - 20:00 | 0 | 0 | 0 | 0 |
| 29.05.2017 20:00 - 21:00 | 0 | 0 | 0 | 0 |
| 29.05.2017 21:00 - 22:00 | 0 | 0 | 0 | 0 |
| 29.05.2017 22:00 - 23:00 | 0 | 0 | 0 | 0 |
| 29.05.2017 23:00 - 24:00 | 0 | 0 | 0 | 0 |
| 30.05.2017 00:00 - 01:00 | 0 | 0 | 0 | 0 |
| 30.05.2017 01:00 - 02:00 | 0 | 0 | 0 | 0 |
| 30.05.2017 02:00 - 03:00 | 0 | -519 | 0 | 0 |
| 30.05.2017 03:00 - 04:00 | 0 | -519 | 0 | 0 |
| 30.05.2017 04:00 - 05:00 | 0 | -519 | 0 | 0 |
| 30.05.2017 05:00 - 06:00 | 0 | -519 | 0 | 0 |
| 30.05.2017 06:00 - 07:00 | 0 | 0 | 0 | 0 |
| 30.05.2017 07:00 - 08:00 | 0 | 0 | 0 | 0 |
| 30.05.2017 08:00 - 09:00 | 0 | 0 | 0 | 0 |
| 30.05.2017 09:00 - 10:00 | 0 | 0 | 0 | 0 |
| 30.05.2017 10:00 - 11:00 | 0 | 0 | 0 | 0 |
| 30.05.2017 11:00 - 12:00 | 0 | 0 | 0 | 0 |
| 30.05.2017 12:00 - 13:00 | 0 | 0 | 0 | 0 |
| 30.05.2017 13:00 - 14:00 | 0 | 0 | 0 | 0 |
| 30.05.2017 14:00 - 15:00 | 0 | 0 | 0 | 0 |
| 30.05.2017 15:00 - 16:00 | 0 | 0 | 0 | 0 |
| 30.05.2017 16:00 - 17:00 | 0 | 0 | 0 | 0 |
| 30.05.2017 17:00 - 18:00 | 0 | 0 | 0 | 0 |
| 30.05.2017 18:00 - 19:00 | 0 | 0 | 0 | 0 |
| 30.05.2017 19:00 - 20:00 | 0 | 0 | 0 | 0 |
| 30.05.2017 20:00 - 21:00 | 0 | 0 | 0 | 0 |
| 30.05.2017 21:00 - 22:00 | 0 | 0 | 0 | 0 |
| 30.05.2017 22:00 - 23:00 | 0 | 0 | 0 | 0 |
| 30.05.2017 23:00 - 24:00 | 0 | -496 | 0 | 0 |
| 31.05.2017 00:00 - 01:00 | 0 | -770 | 0 | 0 |
| 31.05.2017 01:00 - 02:00 | 0 | -770 | 0 | 0 |
| 31.05.2017 02:00 - 03:00 | 0 | -770 | 0 | 0 |
| 31.05.2017 03:00 - 04:00 | 0 | -770 | 0 | 0 |
| 31.05.2017 04:00 - 05:00 | 0 | -770 | 0 | 0 |
| 31.05.2017 05:00 - 06:00 | 0 | -770 | 0 | 0 |
| 31.05.2017 06:00 - 07:00 | 0 | 0 | 0 | 0 |
| 31.05.2017 07:00 - 08:00 | 0 | 0 | 0 | 0 |
| 31.05.2017 08:00 - 09:00 | 0 | 0 | 0 | 0 |
| 31.05.2017 09:00 - 10:00 | 0 | 0 | 0 | 0 |
| 31.05.2017 10:00 - 11:00 | 0 | 0 | 0 | 0 |
| 31.05.2017 11:00 - 12:00 | 0 | 0 | 0 | 0 |
| 31.05.2017 12:00 - 13:00 | 0 | 0 | 0 | 0 |
| 31.05.2017 13:00 - 14:00 | 0 | 0 | 0 | 0 |
| 31.05.2017 14:00 - 15:00 | 0 | -300 | 0 | 0 |
| 31.05.2017 15:00 - 16:00 | 0 | -300 | 0 | 0 |
| 31.05.2017 16:00 - 17:00 | 0 | -300 | 0 | 0 |
| 31.05.2017 17:00 - 18:00 | 0 | -300 | 0 | 0 |
| 31.05.2017 18:00 - 19:00 | 0 | -300 | 0 | 0 |
| 31.05.2017 19:00 - 20:00 | 0 | -300 | 0 | 0 |
| 31.05.2017 20:00 - 21:00 | 0 | -300 | 0 | 0 |
| 31.05.2017 21:00 - 22:00 | 0 | -300 | 0 | 0 |
| 31.05.2017 22:00 - 23:00 | 0 | -300 | 0 | 0 |
| 31.05.2017 23:00 - 24:00 | 0 | -300 | 0 | 0 |
| 01.06.2017 00:00 - 01:00 | 0 | -300 | 0 | 0 |
| 01.06.2017 01:00 - 02:00 | 0 | -300 | 0 | 0 |
| 01.06.2017 02:00 - 03:00 | 0 | -300 | 0 | 0 |
| 01.06.2017 03:00 - 04:00 | 0 | -300 | 0 | 0 |
| 01.06.2017 04:00 - 05:00 | 0 | -300 | 0 | 0 |
| 01.06.2017 05:00 - 06:00 | 0 | -300 | 0 | 0 |